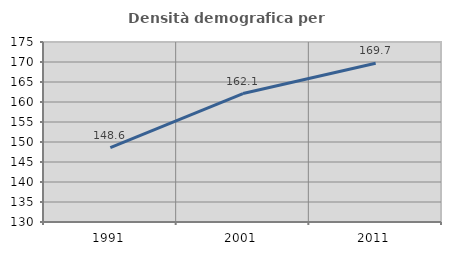
| Category | Densità demografica |
|---|---|
| 1991.0 | 148.597 |
| 2001.0 | 162.106 |
| 2011.0 | 169.682 |